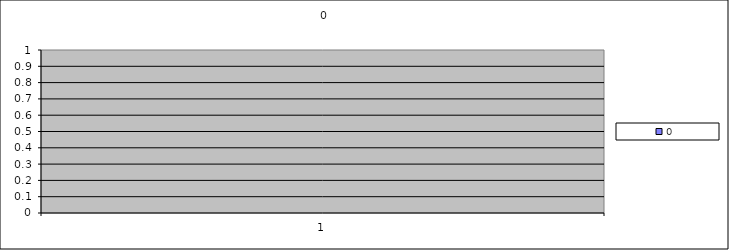
| Category | 0 |
|---|---|
| 0 | 0 |